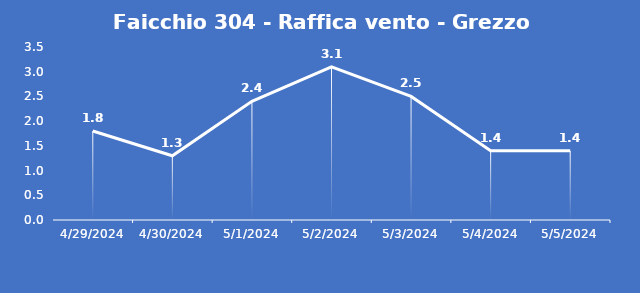
| Category | Faicchio 304 - Raffica vento - Grezzo (m/s) |
|---|---|
| 4/29/24 | 1.8 |
| 4/30/24 | 1.3 |
| 5/1/24 | 2.4 |
| 5/2/24 | 3.1 |
| 5/3/24 | 2.5 |
| 5/4/24 | 1.4 |
| 5/5/24 | 1.4 |